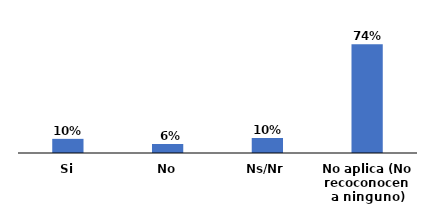
| Category | Series 0 |
|---|---|
| Si | 0.096 |
| No | 0.062 |
| Ns/Nr | 0.102 |
| No aplica (No recoconocen a ninguno) | 0.74 |